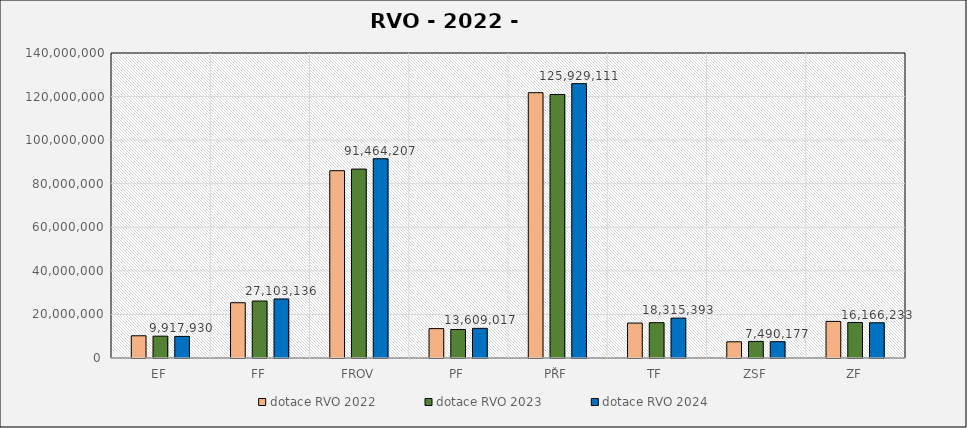
| Category | dotace RVO 2022 | dotace RVO 2023 | dotace RVO 2024 |
|---|---|---|---|
| EF | 10201944.466 | 10025698.298 | 9917929.787 |
| FF | 25367871.084 | 26148182.668 | 27103135.623 |
| FROV | 85966962.709 | 86718740.402 | 91464206.549 |
| PF | 13485384.738 | 13091605.049 | 13609017.317 |
| PŘF | 121776657.11 | 120965027.71 | 125929111.031 |
| TF | 16035037.873 | 16206367.634 | 18315393.114 |
| ZSF | 7445749.873 | 7619402.787 | 7490177.321 |
| ZF | 16803817.327 | 16308400.631 | 16166233.338 |